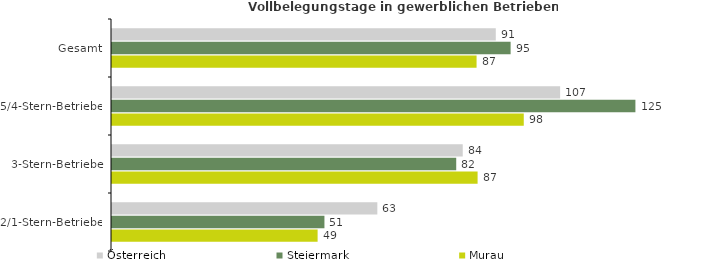
| Category | Österreich | Steiermark | Murau |
|---|---|---|---|
| Gesamt | 91.375 | 94.907 | 86.801 |
| 5/4-Stern-Betriebe | 106.695 | 124.622 | 98.04 |
| 3-Stern-Betriebe | 83.508 | 81.957 | 87.047 |
| 2/1-Stern-Betriebe | 63.173 | 50.58 | 48.955 |